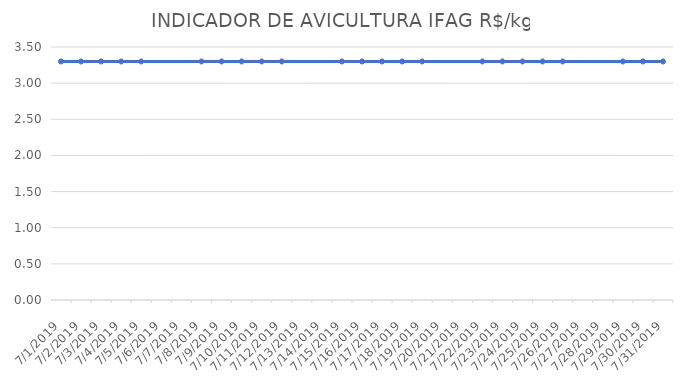
| Category | INDICADOR DE AVICULTURA IFAG |
|---|---|
| 7/1/19 | 3.3 |
| 7/2/19 | 3.3 |
| 7/3/19 | 3.3 |
| 7/4/19 | 3.3 |
| 7/5/19 | 3.3 |
| 7/8/19 | 3.3 |
| 7/9/19 | 3.3 |
| 7/10/19 | 3.3 |
| 7/11/19 | 3.3 |
| 7/12/19 | 3.3 |
| 7/15/19 | 3.3 |
| 7/16/19 | 3.3 |
| 7/17/19 | 3.3 |
| 7/18/19 | 3.3 |
| 7/19/19 | 3.3 |
| 7/22/19 | 3.3 |
| 7/23/19 | 3.3 |
| 7/24/19 | 3.3 |
| 7/25/19 | 3.3 |
| 7/26/19 | 3.3 |
| 7/29/19 | 3.3 |
| 7/30/19 | 3.3 |
| 7/31/19 | 3.3 |